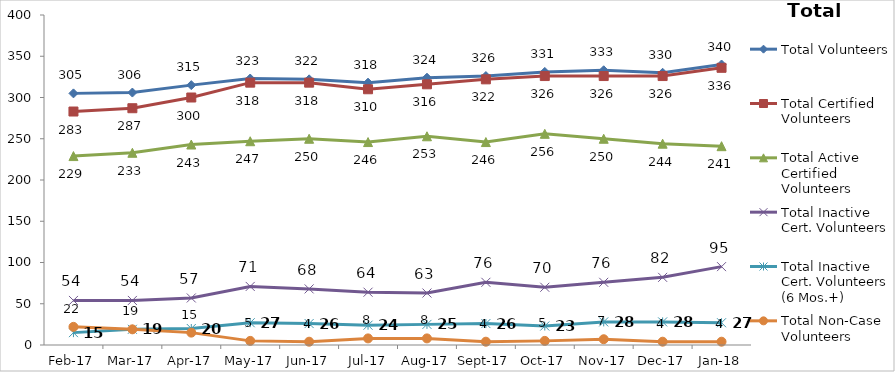
| Category | Total Volunteers | Total Certified Volunteers | Total Active Certified Volunteers | Total Inactive Cert. Volunteers | Total Inactive Cert. Volunteers (6 Mos.+) | Total Non-Case Volunteers |
|---|---|---|---|---|---|---|
| 2017-02-01 | 305 | 283 | 229 | 54 | 15 | 22 |
| 2017-03-01 | 306 | 287 | 233 | 54 | 19 | 19 |
| 2017-04-01 | 315 | 300 | 243 | 57 | 20 | 15 |
| 2017-05-01 | 323 | 318 | 247 | 71 | 27 | 5 |
| 2017-06-01 | 322 | 318 | 250 | 68 | 26 | 4 |
| 2017-07-01 | 318 | 310 | 246 | 64 | 24 | 8 |
| 2017-08-01 | 324 | 316 | 253 | 63 | 25 | 8 |
| 2017-09-01 | 326 | 322 | 246 | 76 | 26 | 4 |
| 2017-10-01 | 331 | 326 | 256 | 70 | 23 | 5 |
| 2017-11-01 | 333 | 326 | 250 | 76 | 28 | 7 |
| 2017-12-01 | 330 | 326 | 244 | 82 | 28 | 4 |
| 2018-01-01 | 340 | 336 | 241 | 95 | 27 | 4 |